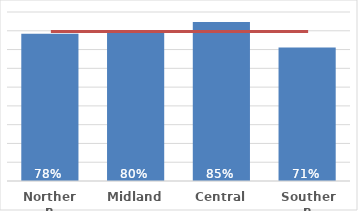
| Category | Dep 5 |
|---|---|
| Northern | 0.784 |
| Midland | 0.796 |
| Central | 0.846 |
| Southern | 0.711 |